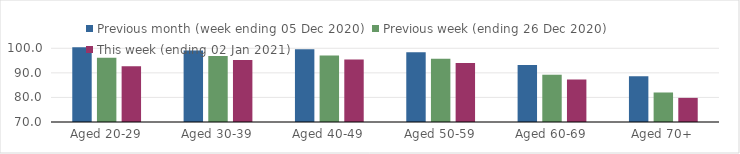
| Category | Previous month (week ending 05 Dec 2020) | Previous week (ending 26 Dec 2020) | This week (ending 02 Jan 2021) |
|---|---|---|---|
| Aged 20-29 | 100.38 | 96.14 | 92.66 |
| Aged 30-39 | 99.13 | 96.88 | 95.26 |
| Aged 40-49 | 99.59 | 97.11 | 95.39 |
| Aged 50-59 | 98.34 | 95.72 | 94.06 |
| Aged 60-69 | 93.18 | 89.24 | 87.27 |
| Aged 70+ | 88.59 | 82.01 | 79.82 |